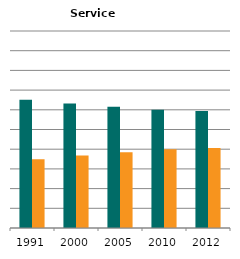
| Category | Male | Female |
|---|---|---|
| 1991.0 | 0.65 | 0.35 |
| 2000.0 | 0.632 | 0.368 |
| 2005.0 | 0.616 | 0.384 |
| 2010.0 | 0.6 | 0.4 |
| 2012.0 | 0.593 | 0.407 |